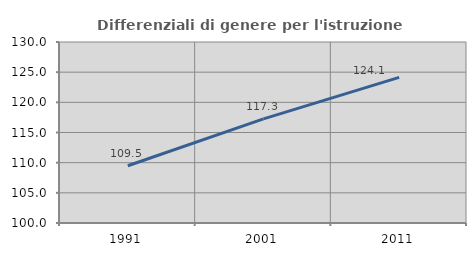
| Category | Differenziali di genere per l'istruzione superiore |
|---|---|
| 1991.0 | 109.49 |
| 2001.0 | 117.257 |
| 2011.0 | 124.136 |